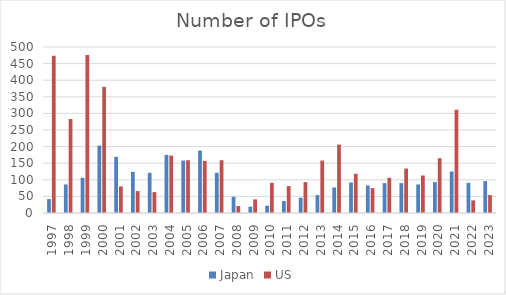
| Category | Japan | US |
|---|---|---|
| 1997.0 | 42 | 474 |
| 1998.0 | 86 | 283 |
| 1999.0 | 106 | 476 |
| 2000.0 | 203 | 380 |
| 2001.0 | 169 | 80 |
| 2002.0 | 124 | 66 |
| 2003.0 | 121 | 63 |
| 2004.0 | 175 | 173 |
| 2005.0 | 158 | 159 |
| 2006.0 | 188 | 157 |
| 2007.0 | 121 | 159 |
| 2008.0 | 49 | 21 |
| 2009.0 | 19 | 41 |
| 2010.0 | 22 | 91 |
| 2011.0 | 36 | 81 |
| 2012.0 | 46 | 93 |
| 2013.0 | 54 | 158 |
| 2014.0 | 77 | 206 |
| 2015.0 | 92 | 118 |
| 2016.0 | 83 | 75 |
| 2017.0 | 90 | 106 |
| 2018.0 | 90 | 134 |
| 2019.0 | 86 | 113 |
| 2020.0 | 93 | 165 |
| 2021.0 | 125 | 311 |
| 2022.0 | 91 | 38 |
| 2023.0 | 96 | 54 |